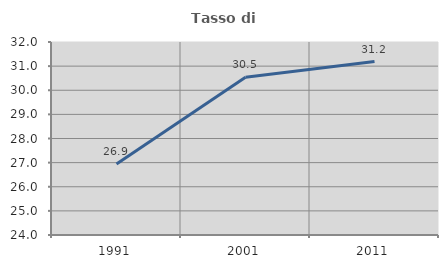
| Category | Tasso di occupazione   |
|---|---|
| 1991.0 | 26.94 |
| 2001.0 | 30.539 |
| 2011.0 | 31.187 |